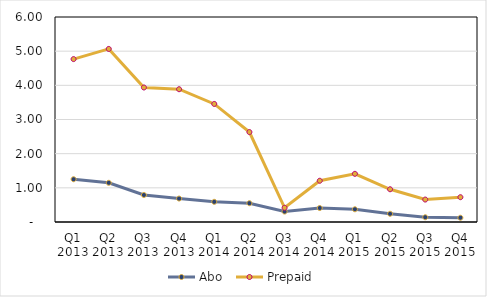
| Category | Abo  | Prepaid |
|---|---|---|
| Q1 2013 | 1.252 | 4.768 |
| Q2 2013 | 1.147 | 5.066 |
| Q3 2013 | 0.79 | 3.937 |
| Q4 2013 | 0.686 | 3.886 |
| Q1 2014 | 0.591 | 3.456 |
| Q2 2014 | 0.55 | 2.632 |
| Q3 2014 | 0.306 | 0.416 |
| Q4 2014 | 0.409 | 1.207 |
| Q1 2015 | 0.373 | 1.41 |
| Q2 2015 | 0.24 | 0.958 |
| Q3 2015 | 0.139 | 0.657 |
| Q4 2015 | 0.125 | 0.726 |